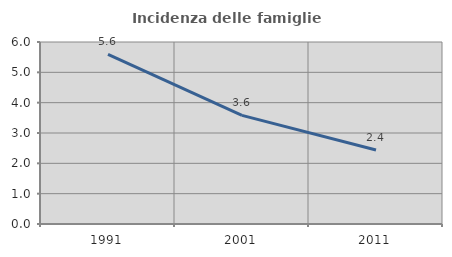
| Category | Incidenza delle famiglie numerose |
|---|---|
| 1991.0 | 5.593 |
| 2001.0 | 3.581 |
| 2011.0 | 2.439 |